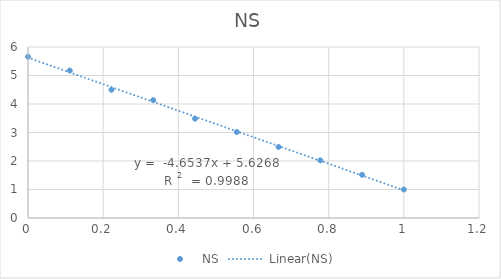
| Category | NS |
|---|---|
| 1.0 | 1 |
| 0.8888878869852718 | 1.516 |
| 0.7777757739705434 | 2.024 |
| 0.6666636609558152 | 2.492 |
| 0.555551547941087 | 3.016 |
| 0.4444394349263587 | 3.484 |
| 0.33332732191163045 | 4.135 |
| 0.22221520889690216 | 4.5 |
| 0.11110309588217389 | 5.175 |
| 0.0 | 5.659 |